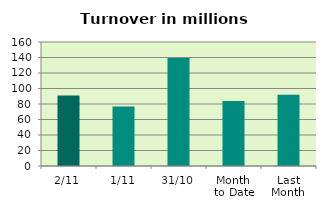
| Category | Series 0 |
|---|---|
| 2/11 | 90.902 |
| 1/11 | 76.824 |
| 31/10 | 139.413 |
| Month 
to Date | 83.863 |
| Last
Month | 91.964 |